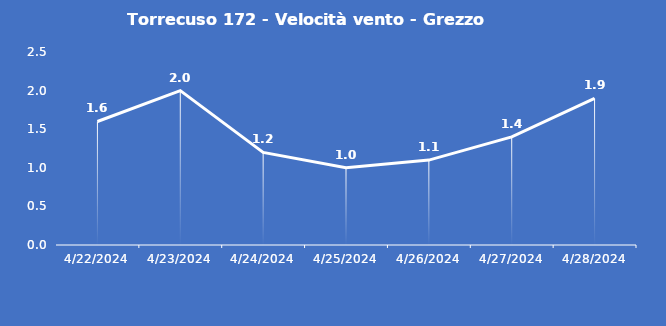
| Category | Torrecuso 172 - Velocità vento - Grezzo (m/s) |
|---|---|
| 4/22/24 | 1.6 |
| 4/23/24 | 2 |
| 4/24/24 | 1.2 |
| 4/25/24 | 1 |
| 4/26/24 | 1.1 |
| 4/27/24 | 1.4 |
| 4/28/24 | 1.9 |